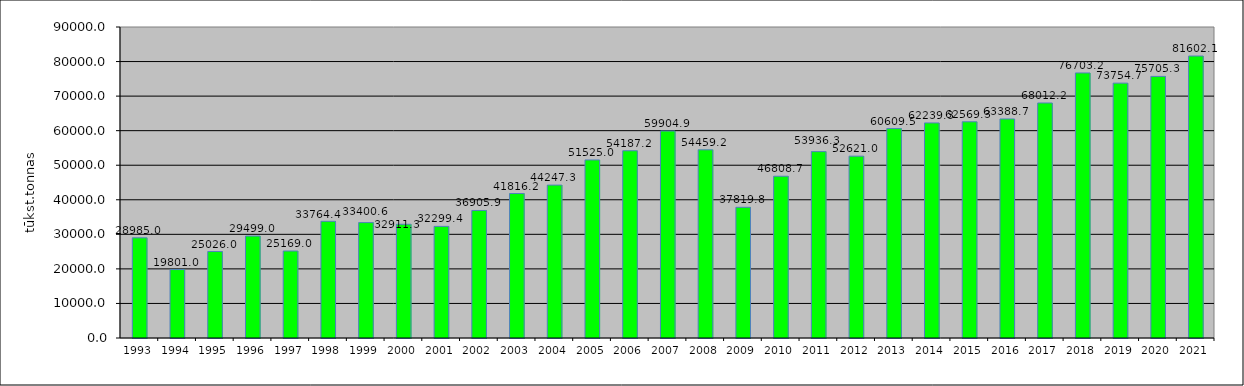
| Category | Series 0 |
|---|---|
| 1993.0 | 28985 |
| 1994.0 | 19801 |
| 1995.0 | 25026 |
| 1996.0 | 29499 |
| 1997.0 | 25169 |
| 1998.0 | 33764.4 |
| 1999.0 | 33400.6 |
| 2000.0 | 32911.3 |
| 2001.0 | 32299.4 |
| 2002.0 | 36905.9 |
| 2003.0 | 41816.2 |
| 2004.0 | 44247.3 |
| 2005.0 | 51525 |
| 2006.0 | 54187.2 |
| 2007.0 | 59904.9 |
| 2008.0 | 54459.2 |
| 2009.0 | 37819.8 |
| 2010.0 | 46808.7 |
| 2011.0 | 53936.3 |
| 2012.0 | 52621 |
| 2013.0 | 60609.5 |
| 2014.0 | 62239.3 |
| 2015.0 | 62569.3 |
| 2016.0 | 63388.7 |
| 2017.0 | 68012.2 |
| 2018.0 | 76703.2 |
| 2019.0 | 73754.7 |
| 2020.0 | 75705.3 |
| 2021.0 | 81602.1 |